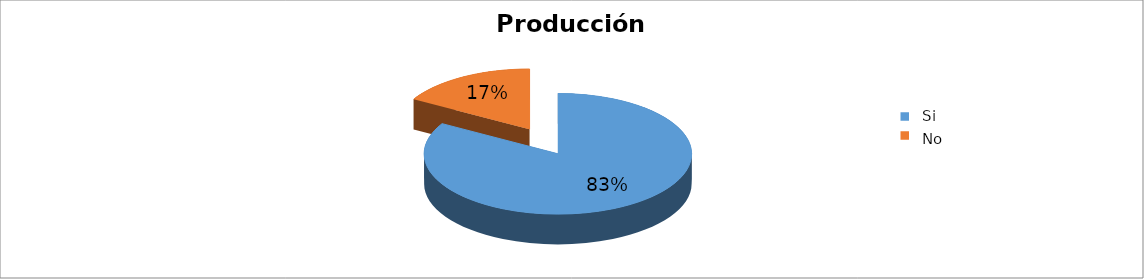
| Category | Series 0 |
|---|---|
| 0 | 0.833 |
| 1 | 0.167 |